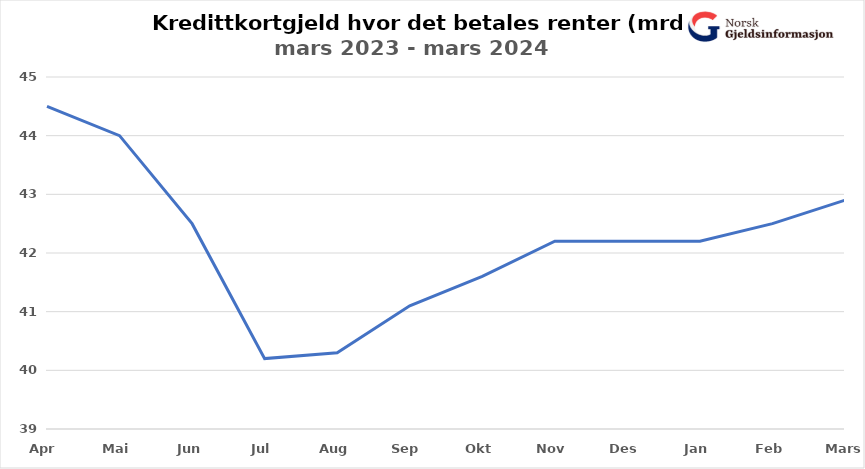
| Category | Rentebærende rammekreditt |
|---|---|
| Apr | 44.5 |
| Mai | 44 |
| Jun | 42.5 |
| Jul | 40.2 |
| Aug | 40.3 |
| Sep | 41.1 |
| Okt | 41.6 |
| Nov | 42.2 |
| Des | 42.2 |
| Jan | 42.2 |
| Feb | 42.5 |
| Mars | 42.9 |